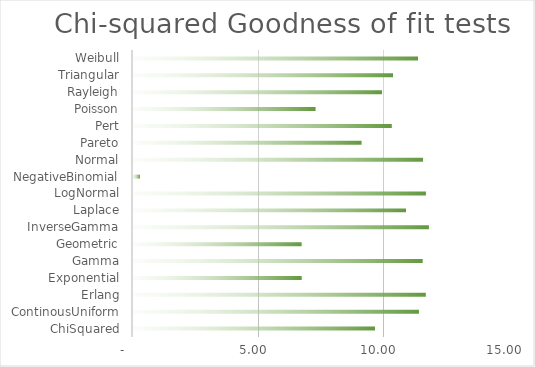
| Category | Goodness of fit |
|---|---|
| ChiSquared | 9.64 |
| ContinousUniform | 11.376 |
| Erlang | 11.65 |
| Exponential | 6.712 |
| Gamma | 11.526 |
| Geometric | 6.709 |
| InverseGamma | 11.773 |
| Laplace | 10.873 |
| LogNormal | 11.655 |
| NegativeBinomial | 0.287 |
| Normal | 11.555 |
| Pareto | 9.094 |
| Pert | 10.297 |
| Poisson | 7.264 |
| Rayleigh | 9.925 |
| Triangular | 10.361 |
| Weibull | 11.344 |